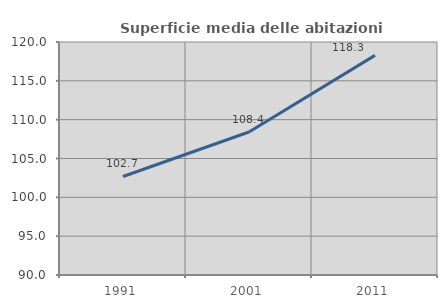
| Category | Superficie media delle abitazioni occupate |
|---|---|
| 1991.0 | 102.685 |
| 2001.0 | 108.407 |
| 2011.0 | 118.28 |